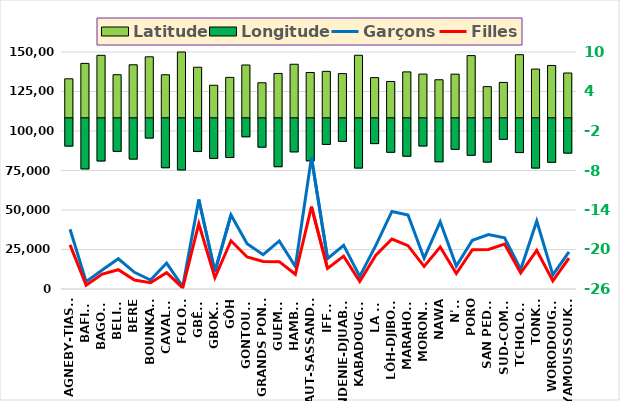
| Category | Latitude | Longitude |
|---|---|---|
| AGNEBY-TIASSA | 5.929 | -4.218 |
| BAFING | 8.269 | -7.683 |
| BAGOUE | 9.496 | -6.477 |
| BELIER | 6.55 | -5.015 |
| BERE | 8.058 | -6.189 |
| BOUNKANI | 9.269 | -2.995 |
| CAVALLY | 6.542 | -7.505 |
| FOLON | 9.998 | -7.835 |
| GBÊKÊ | 7.685 | -5.029 |
| GBOKLE | 4.949 | -6.087 |
| GÔH | 6.144 | -5.953 |
| GONTOUGO | 8.027 | -2.805 |
| GRANDS PONTS | 5.327 | -4.379 |
| GUEMON | 6.742 | -7.346 |
| HAMBOL | 8.139 | -5.095 |
| HAUT-SASSANDRA | 6.885 | -6.449 |
| IFFOU | 7.058 | -3.958 |
| INDENIE-DJUABLIN | 6.719 | -3.5 |
| KABADOUGOU | 9.503 | -7.552 |
| LA ME | 6.111 | -3.838 |
| LÔH-DJIBOUA | 5.523 | -5.159 |
| MARAHOUE | 6.979 | -5.753 |
| MORONOU | 6.644 | -4.2 |
| NAWA | 5.785 | -6.598 |
| N'ZI | 6.636 | -4.706 |
| PORO | 9.455 | -5.612 |
| SAN PEDRO | 4.739 | -6.645 |
| SUD-COMOE | 5.378 | -3.188 |
| TCHOLOGO | 9.588 | -5.198 |
| TONKPI | 7.406 | -7.553 |
| WORODOUGOU | 7.956 | -6.681 |
| YAMOUSSOUKRO | 6.812 | -5.282 |